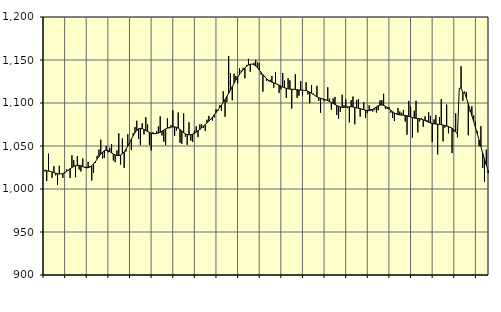
| Category | Piggar | Series 1 |
|---|---|---|
| nan | 1020.4 | 1022.06 |
| 1.0 | 1009.2 | 1021.32 |
| 1.0 | 1041.1 | 1020.83 |
| 1.0 | 1020.2 | 1020.38 |
| 1.0 | 1013.1 | 1019.77 |
| 1.0 | 1026.5 | 1019.11 |
| 1.0 | 1015.9 | 1018.29 |
| 1.0 | 1004.8 | 1017.75 |
| 1.0 | 1027 | 1017.39 |
| 1.0 | 1017.5 | 1017.51 |
| 1.0 | 1012.9 | 1018.12 |
| 1.0 | 1018.3 | 1019.17 |
| nan | 1022.9 | 1020.57 |
| 2.0 | 1021.6 | 1022.12 |
| 2.0 | 1012.8 | 1023.63 |
| 2.0 | 1039.2 | 1024.98 |
| 2.0 | 1033.5 | 1026.19 |
| 2.0 | 1013.6 | 1027.11 |
| 2.0 | 1038.2 | 1027.57 |
| 2.0 | 1022.7 | 1027.54 |
| 2.0 | 1020.4 | 1026.97 |
| 2.0 | 1035.6 | 1026.07 |
| 2.0 | 1024.5 | 1025.22 |
| 2.0 | 1026 | 1024.72 |
| nan | 1031.4 | 1024.78 |
| 3.0 | 1026.6 | 1025.52 |
| 3.0 | 1009.8 | 1026.97 |
| 3.0 | 1018.9 | 1029.09 |
| 3.0 | 1030.4 | 1031.74 |
| 3.0 | 1038.5 | 1034.75 |
| 3.0 | 1045.9 | 1037.85 |
| 3.0 | 1057.3 | 1040.69 |
| 3.0 | 1035.4 | 1042.93 |
| 3.0 | 1036.1 | 1044.4 |
| 3.0 | 1049.9 | 1044.96 |
| 3.0 | 1042.7 | 1044.61 |
| nan | 1047.9 | 1043.51 |
| 4.0 | 1052.2 | 1042.06 |
| 4.0 | 1033.2 | 1040.64 |
| 4.0 | 1031.2 | 1039.55 |
| 4.0 | 1044.9 | 1038.87 |
| 4.0 | 1064.7 | 1038.8 |
| 4.0 | 1028.4 | 1039.47 |
| 4.0 | 1058.9 | 1040.91 |
| 4.0 | 1024.5 | 1043.22 |
| 4.0 | 1043.5 | 1046.31 |
| 4.0 | 1063.6 | 1049.93 |
| 4.0 | 1052.3 | 1053.86 |
| nan | 1045.3 | 1057.98 |
| 5.0 | 1064.8 | 1061.93 |
| 5.0 | 1072.1 | 1065.41 |
| 5.0 | 1079.4 | 1068.15 |
| 5.0 | 1058.2 | 1069.9 |
| 5.0 | 1051 | 1070.49 |
| 5.0 | 1076.4 | 1070.14 |
| 5.0 | 1063.5 | 1069.18 |
| 5.0 | 1083.5 | 1067.98 |
| 5.0 | 1075 | 1066.82 |
| 5.0 | 1051.3 | 1065.77 |
| 5.0 | 1044.9 | 1064.94 |
| nan | 1066 | 1064.41 |
| 6.0 | 1065.1 | 1064.29 |
| 6.0 | 1067.2 | 1064.55 |
| 6.0 | 1072.7 | 1065.09 |
| 6.0 | 1084.4 | 1065.98 |
| 6.0 | 1062.2 | 1067.25 |
| 6.0 | 1055 | 1068.56 |
| 6.0 | 1051 | 1069.75 |
| 6.0 | 1082.2 | 1070.77 |
| 6.0 | 1070.5 | 1071.48 |
| 6.0 | 1074.2 | 1071.95 |
| 6.0 | 1091.4 | 1072.27 |
| nan | 1061.8 | 1072.28 |
| 7.0 | 1068 | 1071.75 |
| 7.0 | 1089 | 1070.7 |
| 7.0 | 1053.7 | 1069.16 |
| 7.0 | 1052.5 | 1067.31 |
| 7.0 | 1087.8 | 1065.48 |
| 7.0 | 1060.7 | 1064.09 |
| 7.0 | 1051.4 | 1063.3 |
| 7.0 | 1077.5 | 1063.04 |
| 7.0 | 1056.2 | 1063.22 |
| 7.0 | 1054.7 | 1063.84 |
| 7.0 | 1068.2 | 1064.83 |
| nan | 1072.9 | 1066.09 |
| 8.0 | 1060.3 | 1067.63 |
| 8.0 | 1075.1 | 1069.3 |
| 8.0 | 1075.2 | 1071.08 |
| 8.0 | 1071.2 | 1072.98 |
| 8.0 | 1067.4 | 1074.9 |
| 8.0 | 1080.6 | 1076.84 |
| 8.0 | 1085 | 1078.91 |
| 8.0 | 1080.2 | 1081.12 |
| 8.0 | 1079.6 | 1083.54 |
| 8.0 | 1083.1 | 1086.17 |
| 8.0 | 1092.7 | 1088.92 |
| nan | 1090.7 | 1091.75 |
| 9.0 | 1097.1 | 1094.65 |
| 9.0 | 1091 | 1097.65 |
| 9.0 | 1113.6 | 1100.73 |
| 9.0 | 1084.1 | 1104.05 |
| 9.0 | 1101.1 | 1107.62 |
| 9.0 | 1154.6 | 1111.34 |
| 9.0 | 1134.7 | 1115.16 |
| 9.0 | 1103.2 | 1119.02 |
| 9.0 | 1134 | 1122.87 |
| 9.0 | 1131.4 | 1126.59 |
| 9.0 | 1122.8 | 1130.04 |
| nan | 1140.1 | 1133.14 |
| 10.0 | 1137.8 | 1135.93 |
| 10.0 | 1140.8 | 1138.5 |
| 10.0 | 1128.7 | 1140.82 |
| 10.0 | 1144.3 | 1142.76 |
| 10.0 | 1151.3 | 1144.25 |
| 10.0 | 1136.4 | 1145.13 |
| 10.0 | 1145.3 | 1145.23 |
| 10.0 | 1146.8 | 1144.57 |
| 10.0 | 1150.2 | 1143.13 |
| 10.0 | 1147.1 | 1140.95 |
| 10.0 | 1146.5 | 1138.34 |
| nan | 1132.9 | 1135.58 |
| 11.0 | 1113.2 | 1132.86 |
| 11.0 | 1131.5 | 1130.35 |
| 11.0 | 1125.9 | 1128.26 |
| 11.0 | 1125.3 | 1126.58 |
| 11.0 | 1127 | 1125.19 |
| 11.0 | 1131.6 | 1124.16 |
| 11.0 | 1117.7 | 1123.41 |
| 11.0 | 1135.6 | 1122.65 |
| 11.0 | 1120.9 | 1121.78 |
| 11.0 | 1111.7 | 1120.8 |
| 11.0 | 1115.8 | 1119.69 |
| nan | 1134.9 | 1118.62 |
| 12.0 | 1126 | 1117.73 |
| 12.0 | 1105.9 | 1117.05 |
| 12.0 | 1128.7 | 1116.51 |
| 12.0 | 1126.3 | 1116.2 |
| 12.0 | 1093.5 | 1116.01 |
| 12.0 | 1115.3 | 1115.86 |
| 12.0 | 1133.4 | 1115.69 |
| 12.0 | 1105.9 | 1115.45 |
| 12.0 | 1108.5 | 1115.15 |
| 12.0 | 1125.6 | 1114.97 |
| 12.0 | 1108.9 | 1114.87 |
| nan | 1114.9 | 1114.73 |
| 13.0 | 1124.1 | 1114.4 |
| 13.0 | 1110 | 1113.71 |
| 13.0 | 1099.7 | 1112.65 |
| 13.0 | 1120.9 | 1111.32 |
| 13.0 | 1111 | 1109.91 |
| 13.0 | 1108.1 | 1108.53 |
| 13.0 | 1119.9 | 1107.23 |
| 13.0 | 1102.4 | 1106.19 |
| 13.0 | 1088.7 | 1105.51 |
| 13.0 | 1104.4 | 1104.96 |
| 13.0 | 1102.2 | 1104.36 |
| nan | 1103.2 | 1103.62 |
| 14.0 | 1118.3 | 1102.69 |
| 14.0 | 1105 | 1101.68 |
| 14.0 | 1092.4 | 1100.64 |
| 14.0 | 1105.2 | 1099.49 |
| 14.0 | 1107.1 | 1098.31 |
| 14.0 | 1086.1 | 1097.18 |
| 14.0 | 1081.7 | 1096.13 |
| 14.0 | 1089.7 | 1095.35 |
| 14.0 | 1109.6 | 1094.98 |
| 14.0 | 1097.3 | 1094.97 |
| 14.0 | 1104 | 1095.18 |
| nan | 1093.9 | 1095.48 |
| 15.0 | 1077.5 | 1095.67 |
| 15.0 | 1103.3 | 1095.63 |
| 15.0 | 1107.5 | 1095.38 |
| 15.0 | 1075.2 | 1094.96 |
| 15.0 | 1103.3 | 1094.4 |
| 15.0 | 1104.4 | 1093.84 |
| 15.0 | 1084.2 | 1093.35 |
| 15.0 | 1092.4 | 1092.84 |
| 15.0 | 1100.7 | 1092.22 |
| 15.0 | 1082.6 | 1091.58 |
| 15.0 | 1088.1 | 1091.15 |
| nan | 1097.3 | 1091.12 |
| 16.0 | 1092.9 | 1091.61 |
| 16.0 | 1090 | 1092.61 |
| 16.0 | 1092.1 | 1093.94 |
| 16.0 | 1088.8 | 1095.41 |
| 16.0 | 1091.5 | 1096.74 |
| 16.0 | 1103 | 1097.55 |
| 16.0 | 1103.4 | 1097.74 |
| 16.0 | 1110.7 | 1097.28 |
| 16.0 | 1093 | 1096.24 |
| 16.0 | 1093.2 | 1094.87 |
| 16.0 | 1095.4 | 1093.28 |
| nan | 1088.7 | 1091.5 |
| 17.0 | 1082.8 | 1089.82 |
| 17.0 | 1079.1 | 1088.41 |
| 17.0 | 1088.1 | 1087.28 |
| 17.0 | 1094.2 | 1086.53 |
| 17.0 | 1090.1 | 1086.15 |
| 17.0 | 1088.7 | 1085.96 |
| 17.0 | 1091.9 | 1085.82 |
| 17.0 | 1078.4 | 1085.57 |
| 17.0 | 1063.2 | 1085.16 |
| 17.0 | 1102.4 | 1084.58 |
| 17.0 | 1095.9 | 1083.83 |
| nan | 1059.8 | 1083.14 |
| 18.0 | 1091 | 1082.6 |
| 18.0 | 1102.6 | 1082.17 |
| 18.0 | 1065.8 | 1081.93 |
| 18.0 | 1078.6 | 1081.69 |
| 18.0 | 1082.4 | 1081.16 |
| 18.0 | 1072.3 | 1080.43 |
| 18.0 | 1084.5 | 1079.59 |
| 18.0 | 1080.1 | 1078.61 |
| 18.0 | 1089.1 | 1077.67 |
| 18.0 | 1085.1 | 1076.82 |
| 18.0 | 1054.6 | 1076.16 |
| nan | 1081 | 1075.81 |
| 19.0 | 1085.9 | 1075.61 |
| 19.0 | 1040.2 | 1075.36 |
| 19.0 | 1083.6 | 1075.08 |
| 19.0 | 1104.5 | 1074.74 |
| 19.0 | 1055.4 | 1074.32 |
| 19.0 | 1071.3 | 1073.84 |
| 19.0 | 1098.1 | 1073.23 |
| 19.0 | 1064.8 | 1072.58 |
| 19.0 | 1071.1 | 1071.81 |
| 19.0 | 1041.8 | 1070.68 |
| 19.0 | 1066.6 | 1069.04 |
| nan | 1088 | 1066.75 |
| 20.0 | 1060 | 1063.64 |
| 20.0 | 1116.8 | 1117.02 |
| 20.0 | 1142.7 | 1117.45 |
| 20.0 | 1102.6 | 1111.99 |
| 20.0 | 1113.3 | 1111.92 |
| 20.0 | 1112.8 | 1105.67 |
| 20.0 | 1062.5 | 1099.07 |
| 20.0 | 1090 | 1092.26 |
| 20.0 | 1096.2 | 1085.39 |
| 20.0 | 1085.6 | 1078.48 |
| 20.0 | 1079.1 | 1071.52 |
| nan | 1067.2 | 1064.29 |
| 21.0 | 1049.8 | 1056.8 |
| 21.0 | 1073 | 1049.26 |
| 21.0 | 1024.5 | 1041.77 |
| 21.0 | 1008.4 | 1034.55 |
| 21.0 | 1045.8 | 1027.94 |
| 21.0 | 1018.5 | 1022.1 |